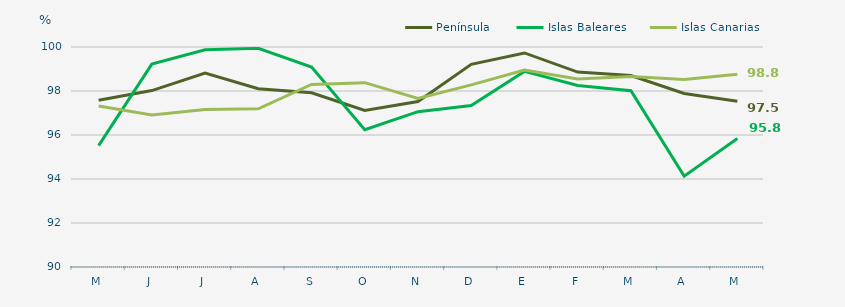
| Category | Península | Islas Baleares | Islas Canarias |
|---|---|---|---|
| M | 97.58 | 95.52 | 97.32 |
| J | 98.02 | 99.22 | 96.91 |
| J | 98.81 | 99.87 | 97.16 |
| A | 98.1 | 99.94 | 97.19 |
| S | 97.92 | 99.09 | 98.3 |
| O | 97.12 | 96.24 | 98.38 |
| N | 97.52 | 97.06 | 97.66 |
| D | 99.21 | 97.34 | 98.28 |
| E | 99.73 | 98.89 | 98.95 |
| F | 98.86 | 98.25 | 98.55 |
| M | 98.7 | 98.01 | 98.66 |
| A | 97.89 | 94.13 | 98.52 |
| M | 97.53 | 95.84 | 98.76 |